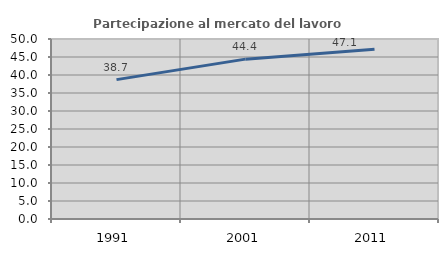
| Category | Partecipazione al mercato del lavoro  femminile |
|---|---|
| 1991.0 | 38.719 |
| 2001.0 | 44.407 |
| 2011.0 | 47.136 |